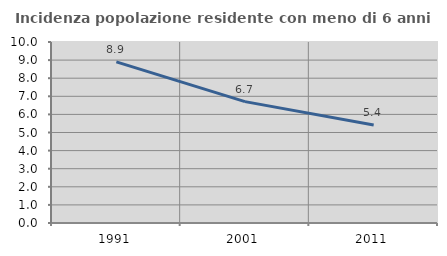
| Category | Incidenza popolazione residente con meno di 6 anni |
|---|---|
| 1991.0 | 8.903 |
| 2001.0 | 6.705 |
| 2011.0 | 5.418 |